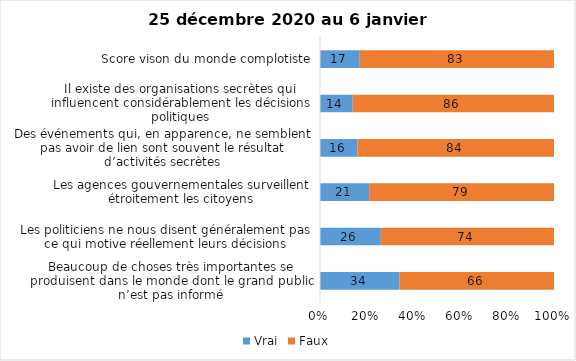
| Category | Vrai | Faux |
|---|---|---|
| Beaucoup de choses très importantes se produisent dans le monde dont le grand public n’est pas informé | 34 | 66 |
| Les politiciens ne nous disent généralement pas ce qui motive réellement leurs décisions | 26 | 74 |
| Les agences gouvernementales surveillent étroitement les citoyens | 21 | 79 |
| Des événements qui, en apparence, ne semblent pas avoir de lien sont souvent le résultat d’activités secrètes | 16 | 84 |
| Il existe des organisations secrètes qui influencent considérablement les décisions politiques | 14 | 86 |
| Score vison du monde complotiste | 17 | 83 |